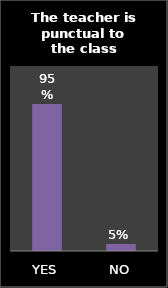
| Category | Series 0 |
|---|---|
| YES | 0.954 |
| NO | 0.046 |